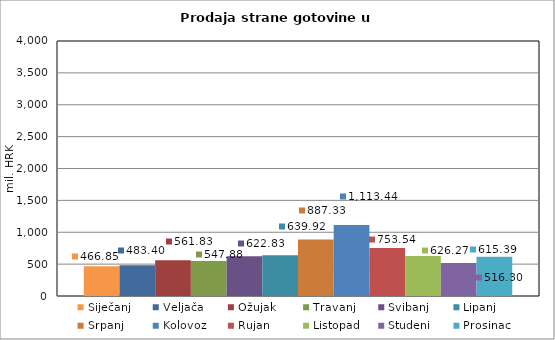
| Category | Siječanj | Veljača | Ožujak | Travanj | Svibanj | Lipanj | Srpanj | Kolovoz | Rujan | Listopad | Studeni | Prosinac |
|---|---|---|---|---|---|---|---|---|---|---|---|---|
| 0 | 466.849 | 483.398 | 561.829 | 547.876 | 622.834 | 639.92 | 887.326 | 1113.443 | 753.539 | 626.271 | 516.303 | 615.385 |